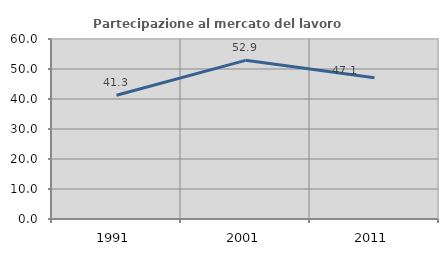
| Category | Partecipazione al mercato del lavoro  femminile |
|---|---|
| 1991.0 | 41.268 |
| 2001.0 | 52.882 |
| 2011.0 | 47.115 |